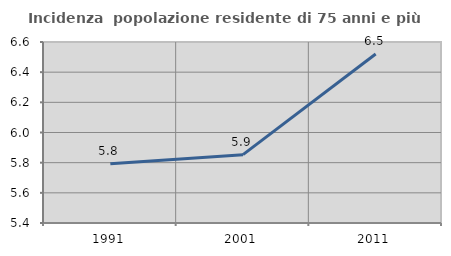
| Category | Incidenza  popolazione residente di 75 anni e più |
|---|---|
| 1991.0 | 5.793 |
| 2001.0 | 5.853 |
| 2011.0 | 6.52 |